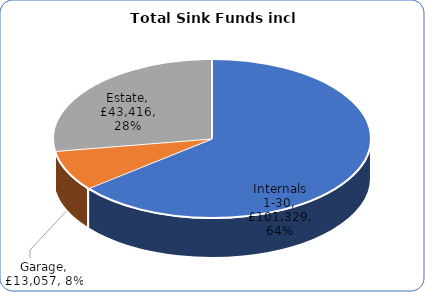
| Category | Series 0 |
|---|---|
| Internals 1-30 | 101328.87 |
| Garage | 13057 |
| Estate | 43415.9 |